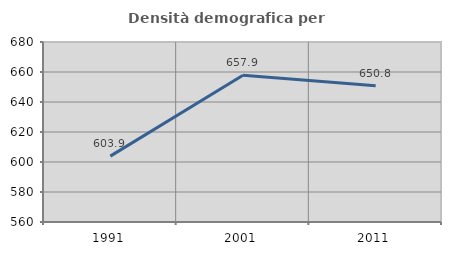
| Category | Densità demografica |
|---|---|
| 1991.0 | 603.908 |
| 2001.0 | 657.864 |
| 2011.0 | 650.826 |